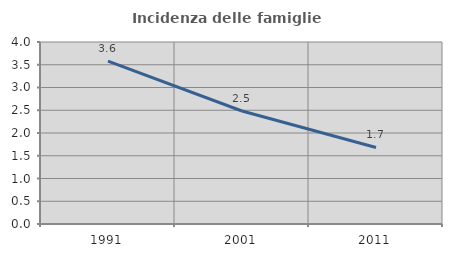
| Category | Incidenza delle famiglie numerose |
|---|---|
| 1991.0 | 3.581 |
| 2001.0 | 2.484 |
| 2011.0 | 1.682 |